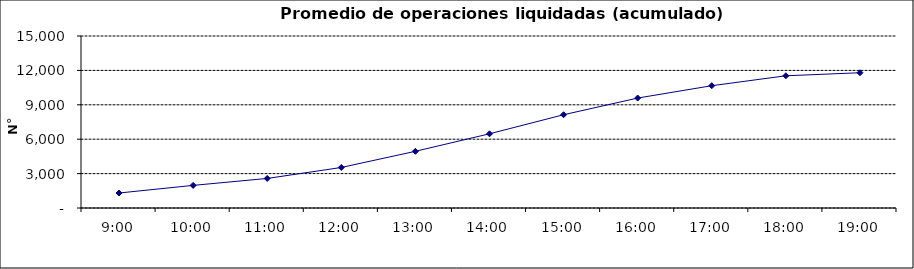
| Category | Promedio Op.Liquidadas (acumulado) |
|---|---|
| 0.375 | 1307 |
| 0.4166666666666667 | 1971.95 |
| 0.4583333333333333 | 2577.35 |
| 0.5 | 3533.6 |
| 0.5416666666666666 | 4943.85 |
| 0.5833333333333334 | 6471.9 |
| 0.625 | 8132.3 |
| 0.6666666666666666 | 9588 |
| 0.7083333333333334 | 10665.4 |
| 0.75 | 11530.95 |
| 0.7916666666666666 | 11795.2 |